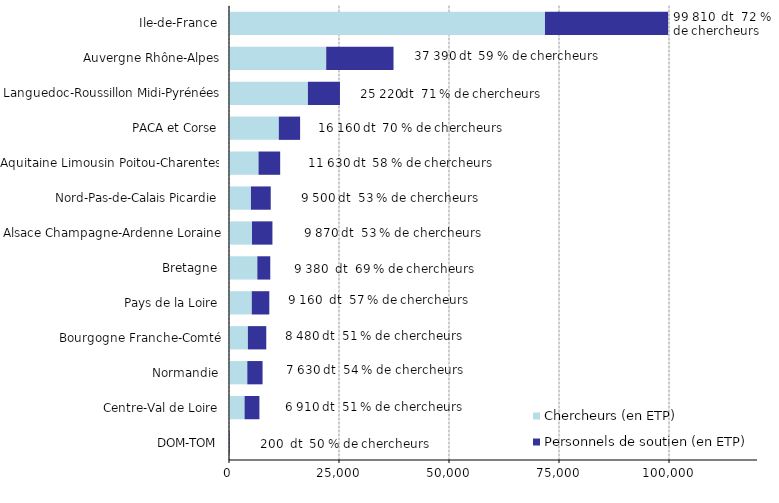
| Category | Chercheurs (en ETP) | Personnels de soutien (en ETP) |
|---|---|---|
| DOM-TOM | 100 | 100 |
| Centre-Val de Loire | 3540 | 3370 |
| Normandie | 4160 | 3470 |
| Bourgogne Franche-Comté | 4290 | 4180 |
| Pays de la Loire | 5180 | 3980 |
| Bretagne | 6440 | 2940 |
| Alsace Champagne-Ardenne Loraine | 5230 | 4640 |
| Nord-Pas-de-Calais Picardie | 4990 | 4500 |
| Aquitaine Limousin Poitou-Charentes | 6710 | 4920 |
| PACA et Corse | 11320 | 4840 |
| Languedoc-Roussillon Midi-Pyrénées | 17930 | 7290 |
| Auvergne Rhône-Alpes | 22090 | 15300 |
| Ile-de-France | 71810 | 28000 |